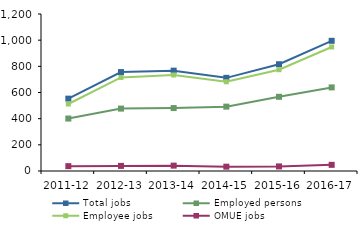
| Category | Total jobs | Employed persons | Employee jobs | OMUE jobs |
|---|---|---|---|---|
| 2011-12 | 553 | 401 | 512 | 37 |
| 2012-13 | 756 | 477 | 715 | 39 |
| 2013-14 | 767 | 481 | 734 | 41 |
| 2014-15 | 712 | 492 | 682 | 33 |
| 2015-16 | 816 | 567 | 774 | 35 |
| 2016-17 | 995 | 639 | 948 | 47 |